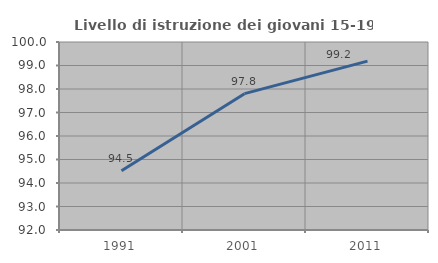
| Category | Livello di istruzione dei giovani 15-19 anni |
|---|---|
| 1991.0 | 94.521 |
| 2001.0 | 97.802 |
| 2011.0 | 99.187 |